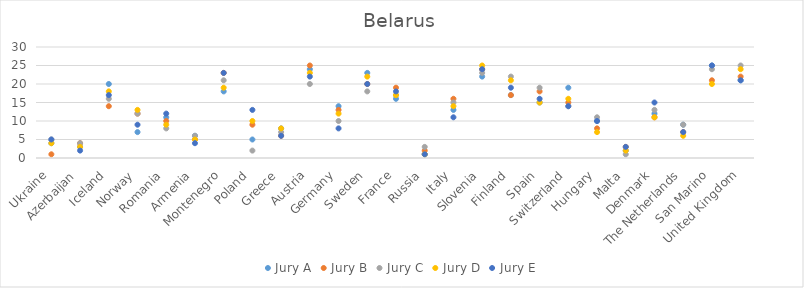
| Category | Jury A | Jury B | Jury C | Jury D | Jury E |
|---|---|---|---|---|---|
| Ukraine | 4 | 1 | 5 | 4 | 5 |
| Azerbaijan | 3 | 4 | 4 | 3 | 2 |
| Iceland | 20 | 14 | 16 | 18 | 17 |
| Norway | 7 | 12 | 12 | 13 | 9 |
| Romania | 11 | 10 | 8 | 9 | 12 |
| Armenia | 6 | 5 | 6 | 5 | 4 |
| Montenegro | 18 | 23 | 21 | 19 | 23 |
| Poland | 5 | 9 | 2 | 10 | 13 |
| Greece | 8 | 6 | 7 | 8 | 6 |
| Austria | 24 | 25 | 20 | 23 | 22 |
| Germany | 14 | 13 | 10 | 12 | 8 |
| Sweden | 23 | 20 | 18 | 22 | 20 |
| France | 16 | 19 | 17 | 17 | 18 |
| Russia | 1 | 2 | 3 | 1 | 1 |
| Italy | 13 | 16 | 15 | 14 | 11 |
| Slovenia | 22 | 24 | 23 | 25 | 24 |
| Finland | 17 | 17 | 22 | 21 | 19 |
| Spain | 15 | 18 | 19 | 15 | 16 |
| Switzerland | 19 | 15 | 14 | 16 | 14 |
| Hungary | 10 | 8 | 11 | 7 | 10 |
| Malta | 2 | 3 | 1 | 2 | 3 |
| Denmark | 12 | 11 | 13 | 11 | 15 |
| The Netherlands | 9 | 7 | 9 | 6 | 7 |
| San Marino | 25 | 21 | 24 | 20 | 25 |
| United Kingdom | 21 | 22 | 25 | 24 | 21 |